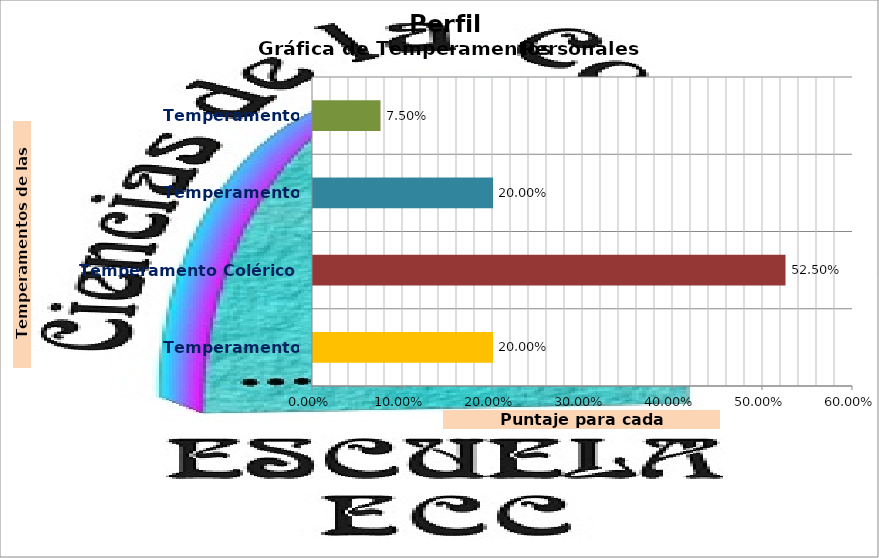
| Category | Series 0 |
|---|---|
| Temperamento Sanguíneo | 0.2 |
| Temperamento Colérico | 0.525 |
| Temperamento Melancólico | 0.2 |
| Temperamento Flemático | 0.075 |